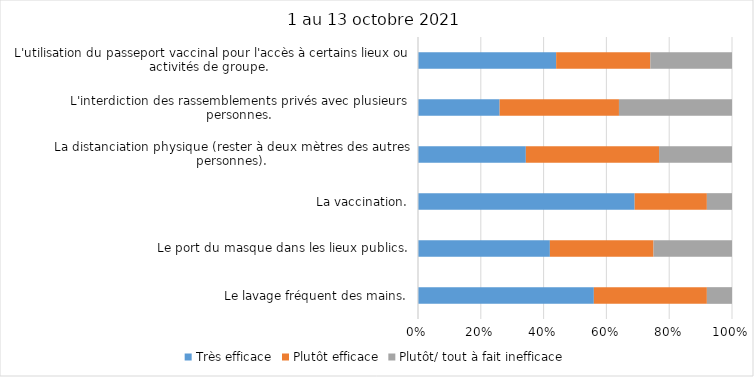
| Category | Très efficace | Plutôt efficace | Plutôt/ tout à fait inefficace |
|---|---|---|---|
| Le lavage fréquent des mains. | 56 | 36 | 8 |
| Le port du masque dans les lieux publics. | 42 | 33 | 25 |
| La vaccination. | 69 | 23 | 8 |
| La distanciation physique (rester à deux mètres des autres personnes). | 34 | 42 | 23 |
| L'interdiction des rassemblements privés avec plusieurs personnes. | 26 | 38 | 36 |
| L'utilisation du passeport vaccinal pour l'accès à certains lieux ou activités de groupe.  | 44 | 30 | 26 |